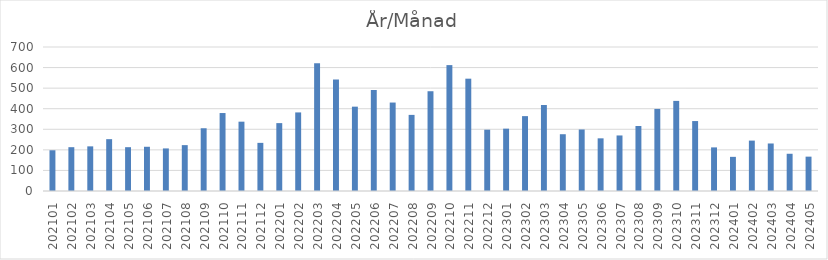
| Category | Summa |
|---|---|
| 202101 | 198 |
| 202102 | 213 |
| 202103 | 217 |
| 202104 | 252 |
| 202105 | 213 |
| 202106 | 215 |
| 202107 | 207 |
| 202108 | 223 |
| 202109 | 305 |
| 202110 | 379 |
| 202111 | 337 |
| 202112 | 234 |
| 202201 | 330 |
| 202202 | 382 |
| 202203 | 621 |
| 202204 | 542 |
| 202205 | 410 |
| 202206 | 491 |
| 202207 | 430 |
| 202208 | 370 |
| 202209 | 485 |
| 202210 | 612 |
| 202211 | 546 |
| 202212 | 298 |
| 202301 | 303 |
| 202302 | 364 |
| 202303 | 418 |
| 202304 | 276 |
| 202305 | 299 |
| 202306 | 256 |
| 202307 | 270 |
| 202308 | 316 |
| 202309 | 399 |
| 202310 | 438 |
| 202311 | 340 |
| 202312 | 212 |
| 202401 | 166 |
| 202402 | 245 |
| 202403 | 231 |
| 202404 | 181 |
| 202405 | 167 |